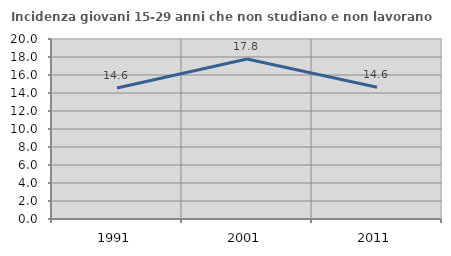
| Category | Incidenza giovani 15-29 anni che non studiano e non lavorano  |
|---|---|
| 1991.0 | 14.563 |
| 2001.0 | 17.778 |
| 2011.0 | 14.634 |